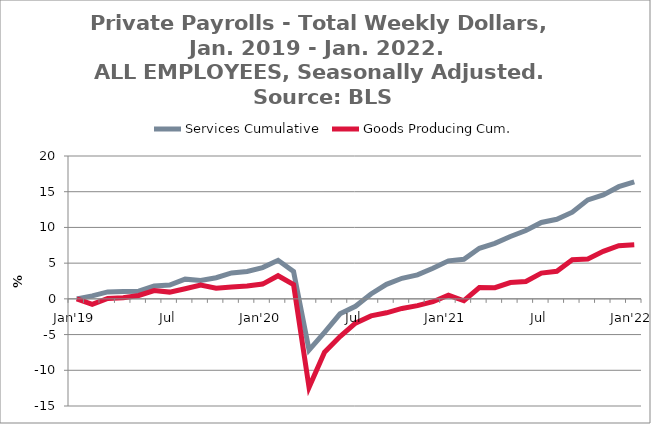
| Category | Services Cumulative | Goods Producing Cum. |
|---|---|---|
| Jan'19 | 0 | 0 |
|  | 0.414 | -0.779 |
|  | 0.977 | 0.058 |
|  | 1.021 | 0.147 |
|  | 1.075 | 0.478 |
|  | 1.803 | 1.155 |
| Jul | 1.93 | 0.946 |
|  | 2.761 | 1.407 |
|  | 2.588 | 1.918 |
|  | 2.961 | 1.475 |
|  | 3.622 | 1.665 |
|  | 3.835 | 1.792 |
| Jan'20 | 4.379 | 2.066 |
|  | 5.401 | 3.238 |
|  | 3.843 | 1.986 |
|  | -7.168 | -12.386 |
|  | -4.69 | -7.459 |
|  | -2.102 | -5.271 |
| Jul | -1.04 | -3.402 |
|  | 0.684 | -2.384 |
|  | 2.035 | -1.954 |
|  | 2.881 | -1.342 |
|  | 3.359 | -0.944 |
|  | 4.288 | -0.399 |
| Jan'21 | 5.324 | 0.527 |
|  | 5.549 | -0.267 |
|  | 7.08 | 1.579 |
|  | 7.774 | 1.57 |
|  | 8.726 | 2.278 |
|  | 9.564 | 2.436 |
| Jul | 10.696 | 3.609 |
|  | 11.135 | 3.861 |
|  | 12.131 | 5.492 |
|  | 13.853 | 5.566 |
|  | 14.563 | 6.646 |
|  | 15.704 | 7.442 |
| Jan'22 | 16.378 | 7.567 |